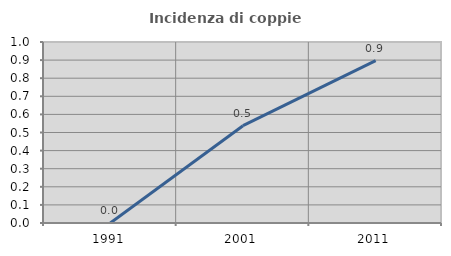
| Category | Incidenza di coppie miste |
|---|---|
| 1991.0 | 0 |
| 2001.0 | 0.538 |
| 2011.0 | 0.897 |